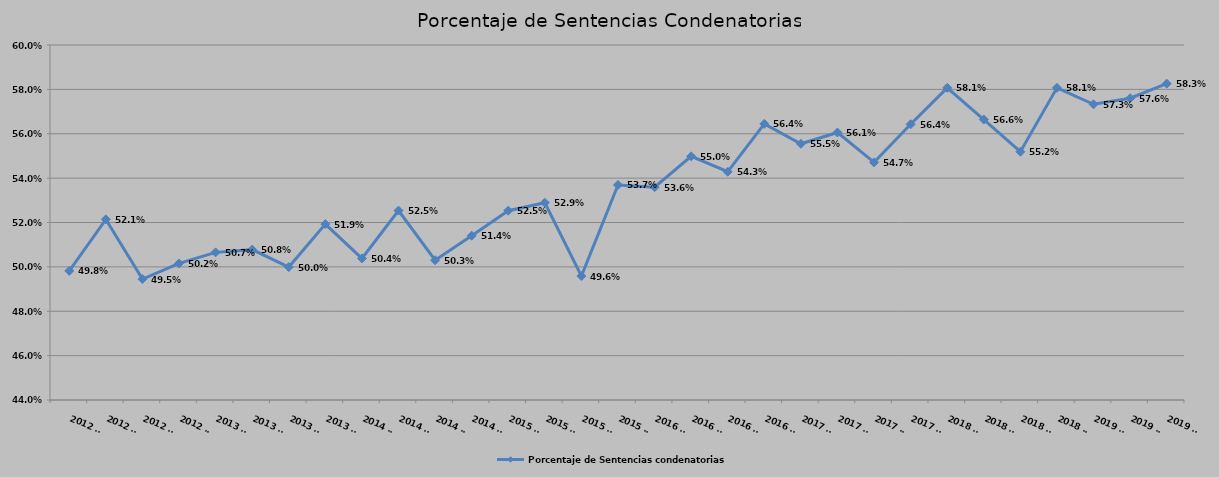
| Category | Porcentaje de Sentencias condenatorias |
|---|---|
| 2012 T1 | 0.498 |
| 2012 T2 | 0.521 |
| 2012 T3 | 0.495 |
| 2012 T4 | 0.502 |
| 2013 T1 | 0.507 |
| 2013 T2 | 0.508 |
| 2013 T3 | 0.5 |
| 2013 T4 | 0.519 |
| 2014 T1 | 0.504 |
| 2014 T2 | 0.525 |
| 2014 T3 | 0.503 |
| 2014 T4 | 0.514 |
| 2015 T1 | 0.525 |
| 2015 T2 | 0.529 |
| 2015 T3 | 0.496 |
| 2015 T4 | 0.537 |
| 2016 T1 | 0.536 |
| 2016 T2 | 0.55 |
| 2016 T3 | 0.543 |
| 2016 T4 | 0.564 |
| 2017 T1 | 0.555 |
| 2017 T2 | 0.561 |
| 2017 T3 | 0.547 |
| 2017 T4 | 0.564 |
| 2018 T1 | 0.581 |
| 2018 T2 | 0.566 |
| 2018 T3 | 0.552 |
| 2018 T4 | 0.581 |
| 2019 T1 | 0.573 |
| 2019 T2 | 0.576 |
| 2019 T3 | 0.583 |